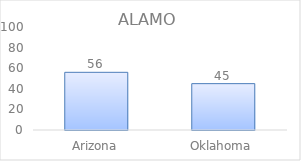
| Category | Series 0 |
|---|---|
| Arizona | 56 |
| Oklahoma | 45 |